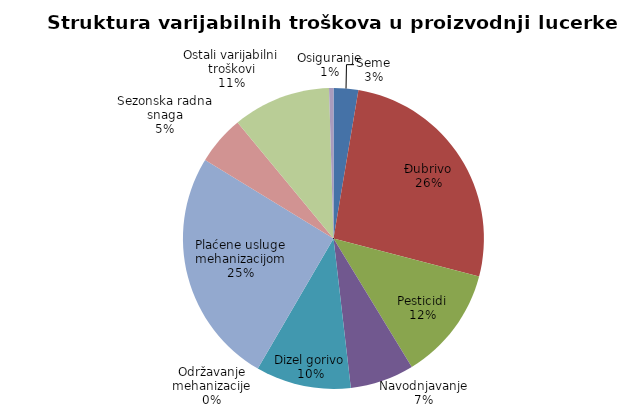
| Category | Series 0 |
|---|---|
| Seme | 2520 |
| Đubrivo | 25100 |
| Pesticidi | 11610 |
| Navodnjavanje | 6525 |
| Dizel gorivo | 9715 |
| Održavanje mehanizacije | 0 |
| Plaćene usluge mehanizacijom | 24080 |
| Sezonska radna snaga | 5000 |
| Ostali varijabilni troškovi | 10000 |
| Osiguranje | 450 |